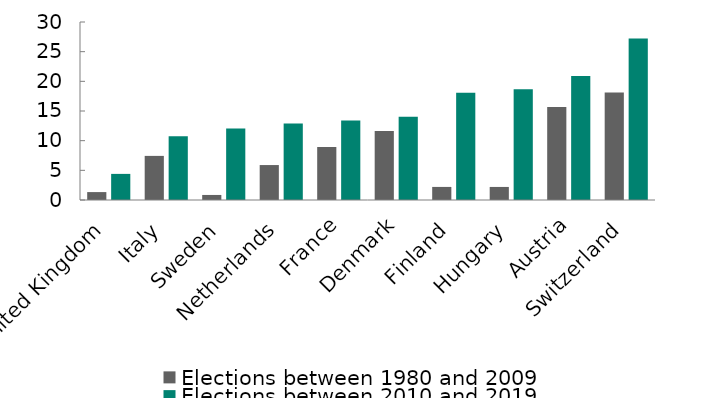
| Category | Elections between 1980 and 2009 | Elections between 2010 and 2019 |
|---|---|---|
| United Kingdom | 1.333 | 4.4 |
| Italy | 7.433 | 10.75 |
| Sweden | 0.85 | 12.033 |
| Netherlands | 5.89 | 12.877 |
| France | 8.926 | 13.4 |
| Denmark | 11.625 | 14.033 |
| Finland | 2.203 | 18.067 |
| Hungary | 2.2 | 18.65 |
| Austria | 15.678 | 20.9 |
| Switzerland | 18.129 | 27.2 |